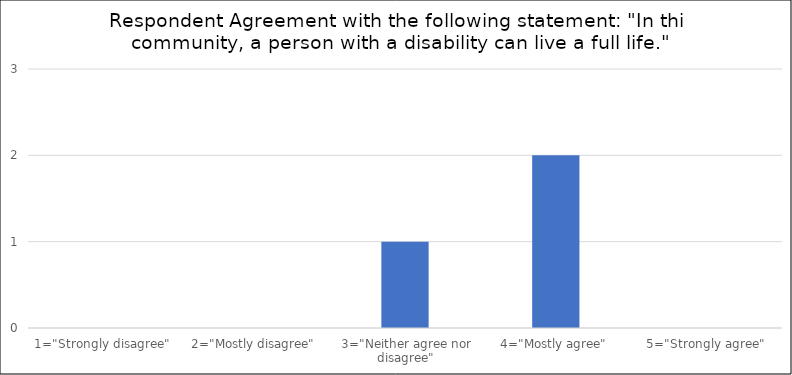
| Category | Number of Responses |
|---|---|
| 1="Strongly disagree" | 0 |
| 2="Mostly disagree" | 0 |
| 3="Neither agree nor disagree" | 1 |
| 4="Mostly agree" | 2 |
| 5="Strongly agree" | 0 |